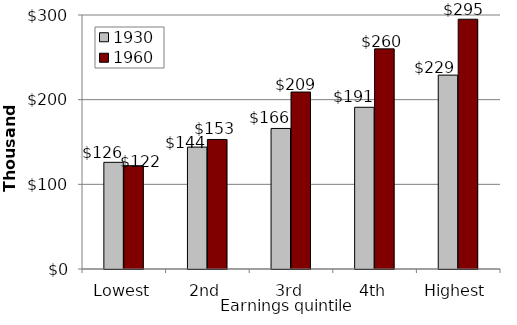
| Category | 1930 | 1960 |
|---|---|---|
| Lowest | 126000 | 122000 |
| 2nd | 144000 | 153000 |
| 3rd | 166000 | 209000 |
| 4th | 191000 | 260000 |
| Highest | 229000 | 295000 |